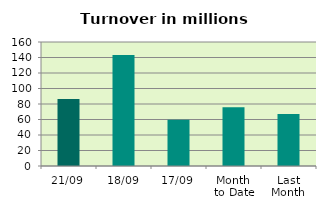
| Category | Series 0 |
|---|---|
| 21/09 | 86.376 |
| 18/09 | 143.241 |
| 17/09 | 59.807 |
| Month 
to Date | 75.866 |
| Last
Month | 66.948 |